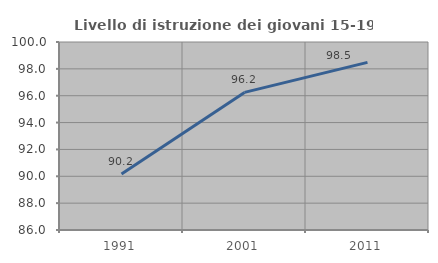
| Category | Livello di istruzione dei giovani 15-19 anni |
|---|---|
| 1991.0 | 90.173 |
| 2001.0 | 96.246 |
| 2011.0 | 98.485 |